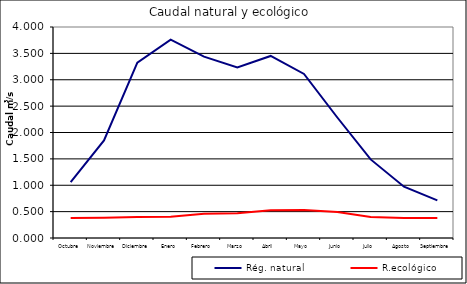
| Category | Rég. natural | R.ecológico |
|---|---|---|
| Octubre | 1.062 | 0.378 |
| Noviembre | 1.85 | 0.384 |
| Diciembre | 3.325 | 0.4 |
| Enero | 3.762 | 0.404 |
| Febrero | 3.439 | 0.462 |
| Marzo | 3.234 | 0.471 |
| Abril | 3.451 | 0.526 |
| Mayo | 3.11 | 0.53 |
| Junio | 2.284 | 0.492 |
| Julio | 1.49 | 0.399 |
| Agosto | 0.972 | 0.378 |
| Septiembre | 0.712 | 0.378 |